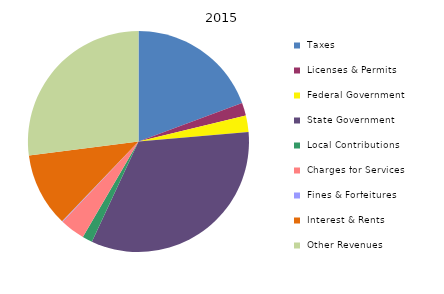
| Category | 2015 |
|---|---|
|  Taxes  | 177084 |
|  Licenses & Permits  | 17149 |
|  Federal Government  | 21999 |
|  State Government  | 304793 |
|  Local Contributions  | 13442 |
|  Charges for Services  | 33477 |
|  Fines & Forfeitures  | 869 |
|  Interest & Rents  | 99035 |
|  Other Revenues  | 247328 |